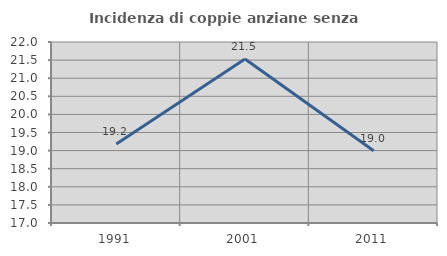
| Category | Incidenza di coppie anziane senza figli  |
|---|---|
| 1991.0 | 19.184 |
| 2001.0 | 21.531 |
| 2011.0 | 18.994 |